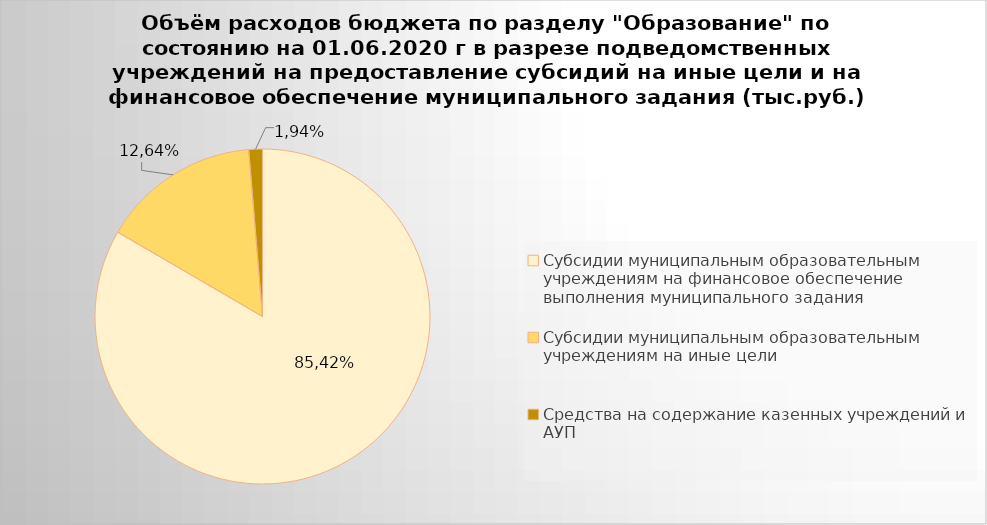
| Category | Series 0 |
|---|---|
| Субсидии муниципальным образовательным учреждениям на финансовое обеспечение выполнения муниципального задания | 4899579.04 |
| Субсидии муниципальным образовательным учреждениям на иные цели | 898447.74 |
| Средства на содержание казенных учреждений и АУП | 77205.7 |